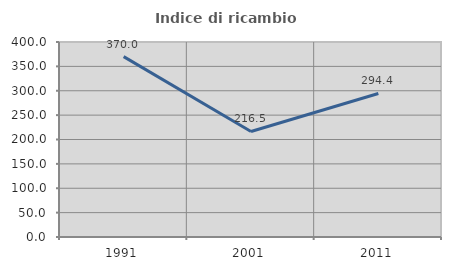
| Category | Indice di ricambio occupazionale  |
|---|---|
| 1991.0 | 370 |
| 2001.0 | 216.471 |
| 2011.0 | 294.444 |